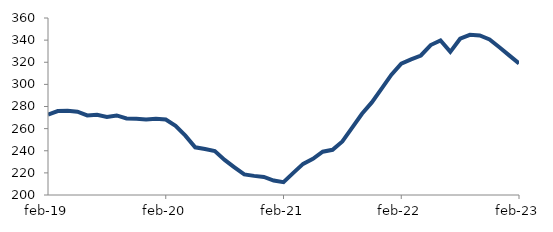
| Category | Series 0 |
|---|---|
| 2019-02-01 | 272.765 |
| 2019-03-01 | 275.922 |
| 2019-04-01 | 276.17 |
| 2019-05-01 | 275.323 |
| 2019-06-01 | 271.933 |
| 2019-07-01 | 272.528 |
| 2019-08-01 | 270.617 |
| 2019-09-01 | 271.909 |
| 2019-10-01 | 269.246 |
| 2019-11-01 | 268.873 |
| 2019-12-01 | 268.319 |
| 2020-01-01 | 268.914 |
| 2020-02-01 | 268.233 |
| 2020-03-01 | 262.58 |
| 2020-04-01 | 253.663 |
| 2020-05-01 | 243.088 |
| 2020-06-01 | 241.541 |
| 2020-07-01 | 239.786 |
| 2020-08-01 | 231.766 |
| 2020-09-01 | 225.047 |
| 2020-10-01 | 218.571 |
| 2020-11-01 | 217.286 |
| 2020-12-01 | 216.368 |
| 2021-01-01 | 213.087 |
| 2021-02-01 | 211.643 |
| 2021-03-01 | 220.04 |
| 2021-04-01 | 228.12 |
| 2021-05-01 | 232.717 |
| 2021-06-01 | 239.097 |
| 2021-07-01 | 240.846 |
| 2021-08-01 | 248.449 |
| 2021-09-01 | 260.934 |
| 2021-10-01 | 273.441 |
| 2021-11-01 | 283.683 |
| 2021-12-01 | 296.134 |
| 2022-01-01 | 308.804 |
| 2022-02-01 | 318.726 |
| 2022-03-01 | 322.592 |
| 2022-04-01 | 326.114 |
| 2022-05-01 | 335.557 |
| 2022-06-01 | 339.684 |
| 2022-07-01 | 329.357 |
| 2022-08-01 | 341.293 |
| 2022-09-01 | 344.793 |
| 2022-10-01 | 344.185 |
| 2022-11-01 | 340.608 |
| 2022-12-01 | 333.559 |
| 2023-01-01 | 326.199 |
| 2023-02-01 | 318.915 |